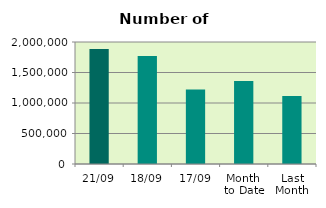
| Category | Series 0 |
|---|---|
| 21/09 | 1884750 |
| 18/09 | 1771224 |
| 17/09 | 1222032 |
| Month 
to Date | 1361591.733 |
| Last
Month | 1113186.286 |